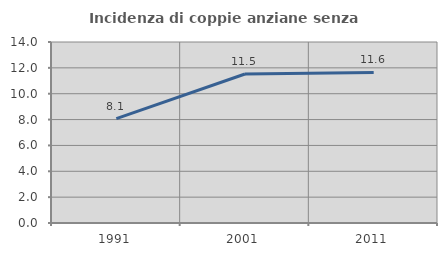
| Category | Incidenza di coppie anziane senza figli  |
|---|---|
| 1991.0 | 8.07 |
| 2001.0 | 11.525 |
| 2011.0 | 11.644 |